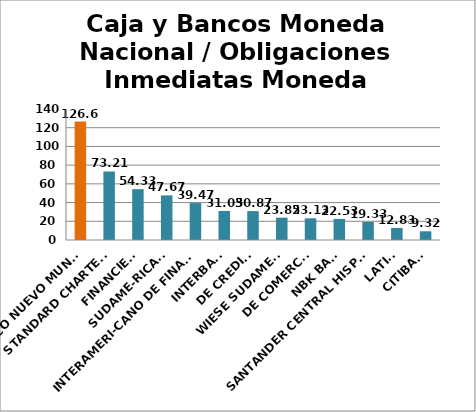
| Category | Series 0 |
|---|---|
| BANCO NUEVO MUNDO | 126.61 |
| STANDARD CHARTERED | 73.21 |
| FINANCIERO | 54.33 |
| SUDAME-RICANO | 47.67 |
| INTERAMERI-CANO DE FINANZAS | 39.47 |
| INTERBANK | 31.05 |
| DE CREDITO | 30.87 |
| WIESE SUDAMERIS | 23.85 |
| DE COMERCIO | 23.13 |
| NBK BANK  | 22.53 |
| SANTANDER CENTRAL HISPANO | 19.33 |
| LATINO | 12.83 |
| CITIBANK | 9.32 |